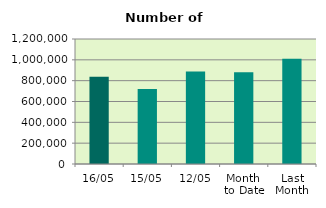
| Category | Series 0 |
|---|---|
| 16/05 | 837656 |
| 15/05 | 721200 |
| 12/05 | 887560 |
| Month 
to Date | 881506.545 |
| Last
Month | 1010681.333 |